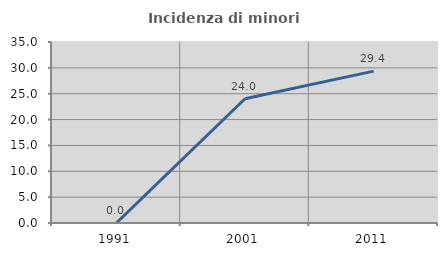
| Category | Incidenza di minori stranieri |
|---|---|
| 1991.0 | 0 |
| 2001.0 | 24.02 |
| 2011.0 | 29.372 |